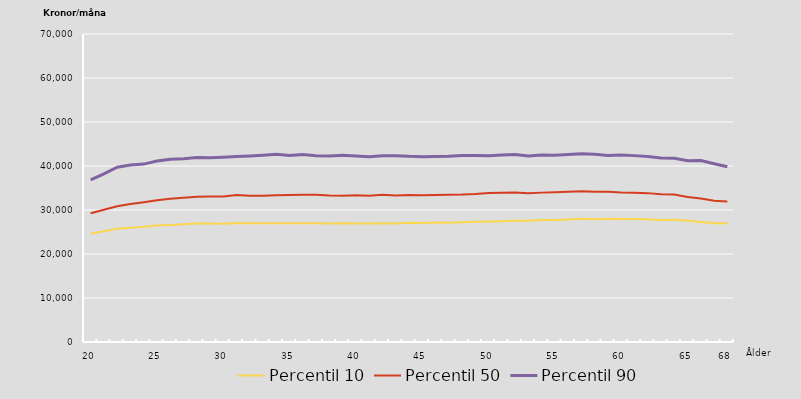
| Category | Percentil 10 | Percentil 50 | Percentil 90 |
|---|---|---|---|
| 20.0 | 24664 | 29244 | 36832 |
| nan | 25159 | 30053 | 38218 |
| nan | 25728 | 30865 | 39723 |
| nan | 25975 | 31341 | 40250 |
| nan | 26175 | 31765 | 40431 |
| 25.0 | 26473 | 32204 | 41149 |
| nan | 26607 | 32553 | 41554 |
| nan | 26753 | 32809 | 41654 |
| nan | 26920 | 33014 | 41952 |
| nan | 26906 | 33060 | 41895 |
| 30.0 | 26891 | 33080 | 42004 |
| nan | 27034 | 33407 | 42150 |
| nan | 27000 | 33266 | 42288 |
| nan | 26970 | 33262 | 42441 |
| nan | 27000 | 33340 | 42652 |
| 35.0 | 27000 | 33434 | 42366 |
| nan | 27000 | 33485 | 42589 |
| nan | 26970 | 33451 | 42338 |
| nan | 26939 | 33323 | 42264 |
| nan | 26979 | 33267 | 42453 |
| 40.0 | 26943 | 33336 | 42262 |
| nan | 26927 | 33249 | 42093 |
| nan | 26979 | 33475 | 42352 |
| nan | 26955 | 33300 | 42338 |
| nan | 27094 | 33385 | 42190 |
| 45.0 | 27036 | 33350 | 42128 |
| nan | 27174 | 33408 | 42179 |
| nan | 27110 | 33492 | 42225 |
| nan | 27200 | 33533 | 42365 |
| nan | 27353 | 33656 | 42366 |
| 50.0 | 27398 | 33870 | 42317 |
| nan | 27458 | 33930 | 42492 |
| nan | 27549 | 34000 | 42608 |
| nan | 27548 | 33830 | 42258 |
| nan | 27700 | 33949 | 42486 |
| 55.0 | 27717 | 34037 | 42436 |
| nan | 27867 | 34170 | 42586 |
| nan | 28000 | 34283 | 42777 |
| nan | 27901 | 34149 | 42643 |
| nan | 27984 | 34150 | 42369 |
| 60.0 | 27978 | 33995 | 42506 |
| nan | 27976 | 33931 | 42358 |
| nan | 27875 | 33835 | 42179 |
| nan | 27751 | 33578 | 41832 |
| nan | 27782 | 33500 | 41759 |
| 65.0 | 27548 | 32943 | 41208 |
| nan | 27274 | 32622 | 41243 |
| nan | 26995 | 32100 | 40500 |
| 68.0 | 27004 | 31938 | 39827 |